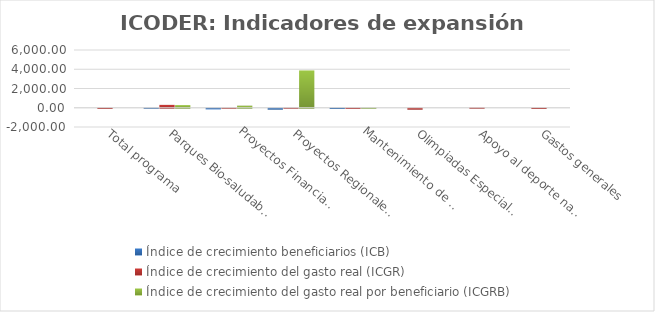
| Category | Índice de crecimiento beneficiarios (ICB)  | Índice de crecimiento del gasto real (ICGR)  | Índice de crecimiento del gasto real por beneficiario (ICGRB)  |
|---|---|---|---|
| Total programa | 0 | -20.771 | 0 |
| Parques Bio-saludables | 6.667 | 298.592 | 273.68 |
| Proyectos Financiados 
a CCDR | -68.657 | -1.453 | 214.412 |
| Proyectos Regionales  | -97.329 | 6.167 | 3875.356 |
| Mantenimiento de 
Instalaciones Deportivas  | -24 | -20.131 | 5.091 |
| Olimpiadas Especiales  | 0 | -100 | 0 |
| Apoyo al deporte nacional | 0 | 35.409 | 0 |
| Gastos generales | 0 | -25.404 | 0 |